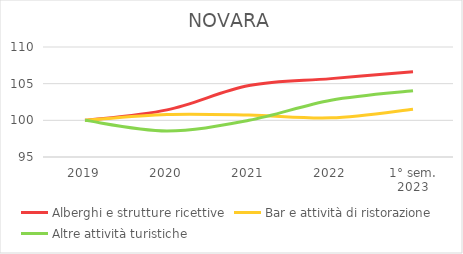
| Category | Alberghi e strutture ricettive | Bar e attività di ristorazione | Altre attività turistiche |
|---|---|---|---|
| 2019 | 100 | 100 | 100 |
| 2020 | 101.422 | 100.802 | 98.557 |
| 2021 | 104.739 | 100.718 | 100 |
| 2022 | 105.687 | 100.338 | 102.742 |
| 1° sem.
2023 | 106.635 | 101.52 | 104.04 |